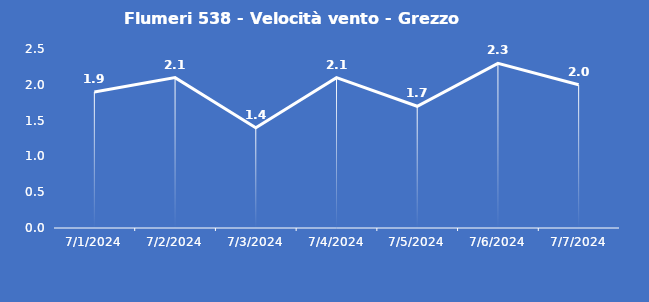
| Category | Flumeri 538 - Velocità vento - Grezzo (m/s) |
|---|---|
| 7/1/24 | 1.9 |
| 7/2/24 | 2.1 |
| 7/3/24 | 1.4 |
| 7/4/24 | 2.1 |
| 7/5/24 | 1.7 |
| 7/6/24 | 2.3 |
| 7/7/24 | 2 |